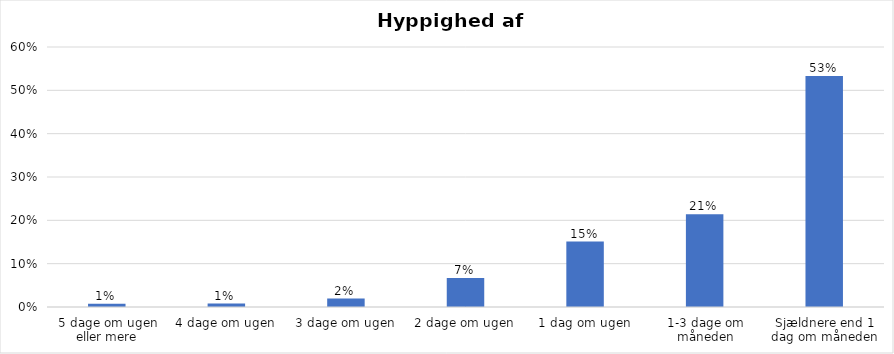
| Category | % |
|---|---|
| 5 dage om ugen eller mere | 0.007 |
| 4 dage om ugen | 0.008 |
| 3 dage om ugen | 0.02 |
| 2 dage om ugen | 0.067 |
| 1 dag om ugen | 0.151 |
| 1-3 dage om måneden | 0.214 |
| Sjældnere end 1 dag om måneden | 0.533 |